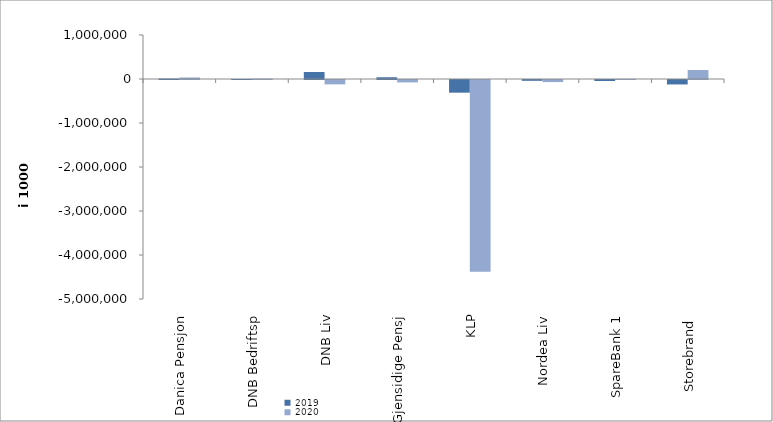
| Category | 2019 | 2020 |
|---|---|---|
| Danica Pensjon | 10954.466 | 35079.998 |
| DNB Bedriftsp | 771 | 7508 |
| DNB Liv | 159065.881 | -98797 |
| Gjensidige Pensj | 39643 | -54821 |
| KLP | -287976.445 | -4358298.597 |
| Nordea Liv | -18522.302 | -47335 |
| SpareBank 1 | -22140.237 | 3188.04 |
| Storebrand  | -100940.097 | 204279.263 |